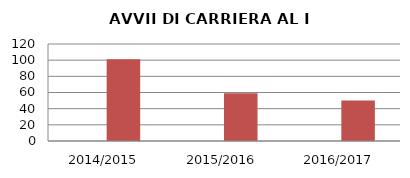
| Category | ANNO | NUMERO |
|---|---|---|
| 2014/2015 | 0 | 101 |
| 2015/2016 | 0 | 59 |
| 2016/2017 | 0 | 50 |